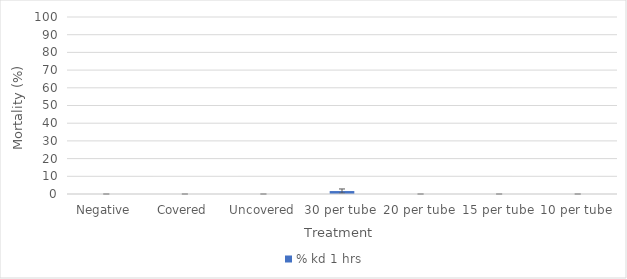
| Category | % kd 1 hrs |
|---|---|
| Negative  | 0 |
| Covered | 0 |
| Uncovered | 0 |
| 30 per tube | 1.667 |
| 20 per tube | 0 |
| 15 per tube | 0 |
| 10 per tube | 0 |